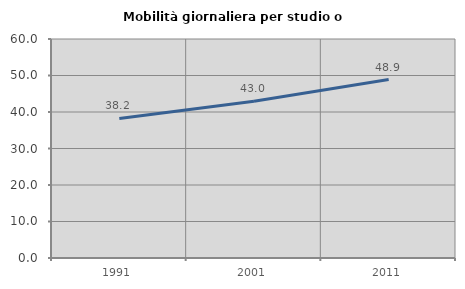
| Category | Mobilità giornaliera per studio o lavoro |
|---|---|
| 1991.0 | 38.245 |
| 2001.0 | 42.966 |
| 2011.0 | 48.894 |